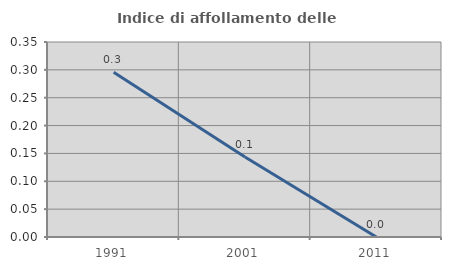
| Category | Indice di affollamento delle abitazioni  |
|---|---|
| 1991.0 | 0.296 |
| 2001.0 | 0.143 |
| 2011.0 | 0 |